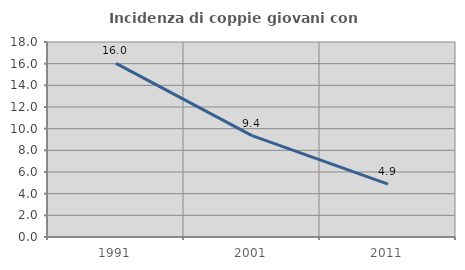
| Category | Incidenza di coppie giovani con figli |
|---|---|
| 1991.0 | 16.024 |
| 2001.0 | 9.365 |
| 2011.0 | 4.878 |